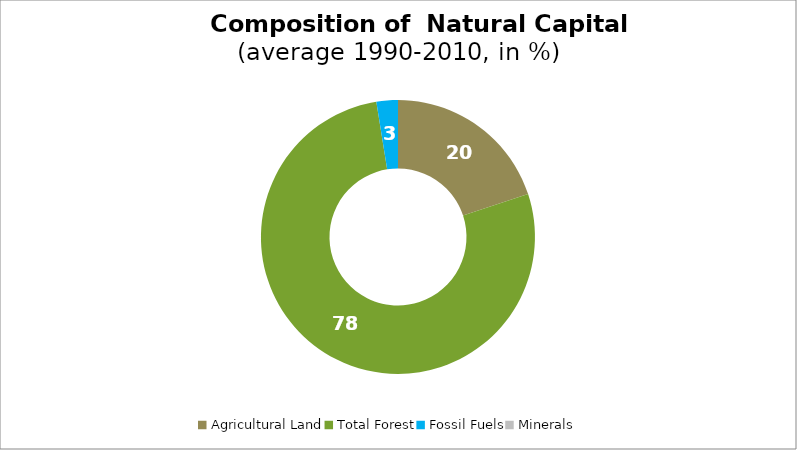
| Category | Series 0 |
|---|---|
| Agricultural Land | 19.925 |
| Total Forest | 77.546 |
| Fossil Fuels | 2.529 |
| Minerals | 0 |